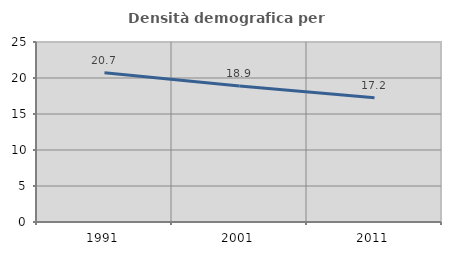
| Category | Densità demografica |
|---|---|
| 1991.0 | 20.744 |
| 2001.0 | 18.875 |
| 2011.0 | 17.241 |